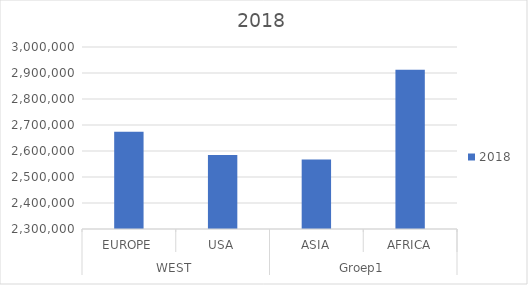
| Category | 2018 |
|---|---|
| 0 | 2674096 |
| 1 | 2584865 |
| 2 | 2566978 |
| 3 | 2912837 |